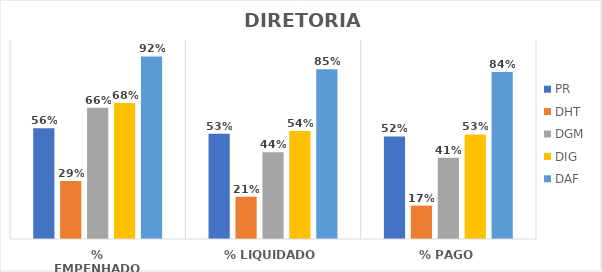
| Category | PR | DHT | DGM | DIG | DAF |
|---|---|---|---|---|---|
| % EMPENHADO | 0.557 | 0.291 | 0.66 | 0.683 | 0.917 |
| % LIQUIDADO | 0.529 | 0.212 | 0.435 | 0.543 | 0.853 |
| % PAGO | 0.515 | 0.168 | 0.408 | 0.525 | 0.839 |